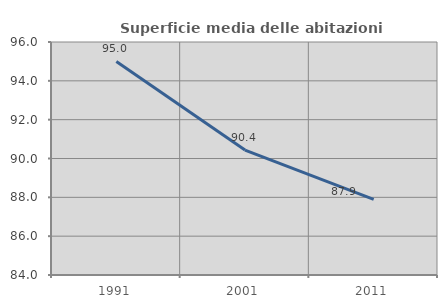
| Category | Superficie media delle abitazioni occupate |
|---|---|
| 1991.0 | 94.997 |
| 2001.0 | 90.434 |
| 2011.0 | 87.896 |